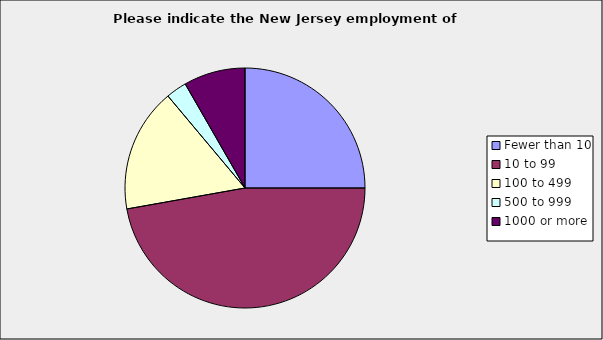
| Category | Series 0 |
|---|---|
| Fewer than 10 | 0.25 |
| 10 to 99 | 0.472 |
| 100 to 499 | 0.167 |
| 500 to 999 | 0.028 |
| 1000 or more | 0.083 |